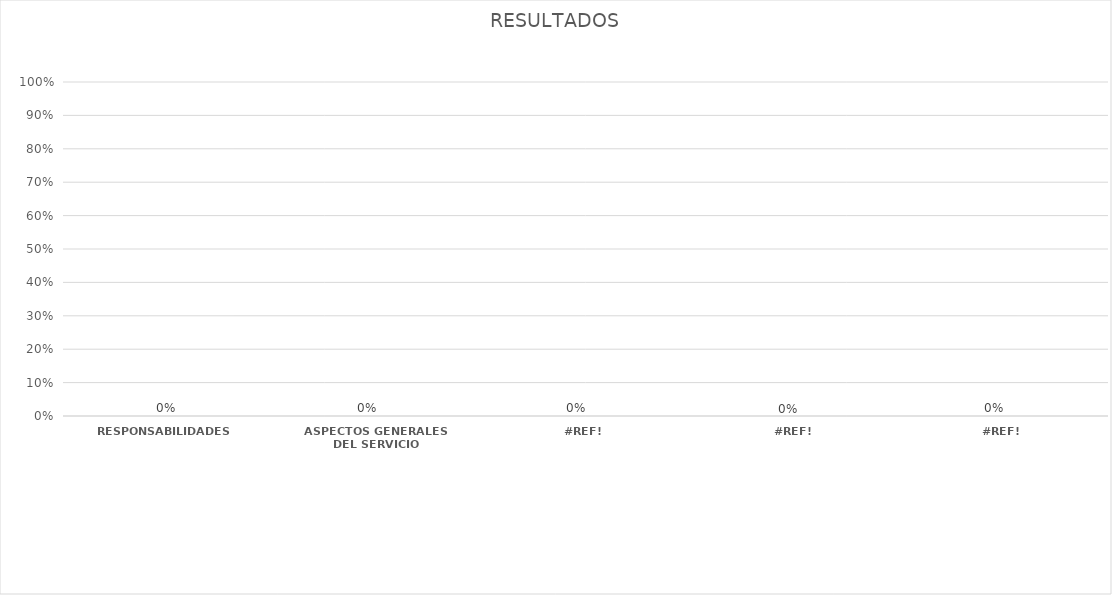
| Category | Series 0 |
|---|---|
| RESPONSABILIDADES | 0 |
| ASPECTOS GENERALES DEL SERVICIO | 0 |
| #¡REF! | 0 |
| #¡REF! | 0 |
| #¡REF! | 0 |